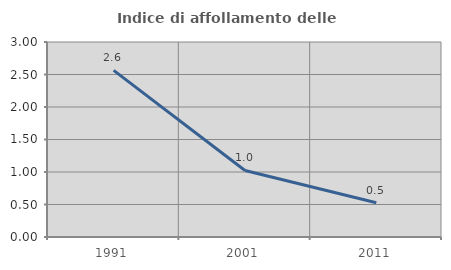
| Category | Indice di affollamento delle abitazioni  |
|---|---|
| 1991.0 | 2.564 |
| 2001.0 | 1.024 |
| 2011.0 | 0.528 |